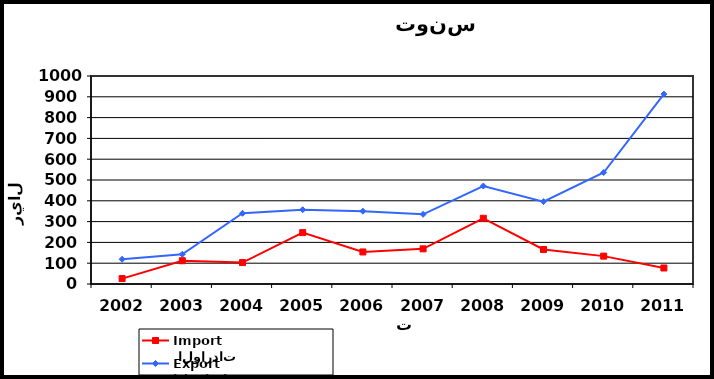
| Category |  الواردات           Import | الصادرات          Export |
|---|---|---|
| 2002.0 | 26 | 119 |
| 2003.0 | 112 | 143 |
| 2004.0 | 103 | 340 |
| 2005.0 | 247 | 357 |
| 2006.0 | 154 | 350 |
| 2007.0 | 169 | 335 |
| 2008.0 | 316 | 471 |
| 2009.0 | 166 | 396 |
| 2010.0 | 134 | 536 |
| 2011.0 | 77 | 913 |